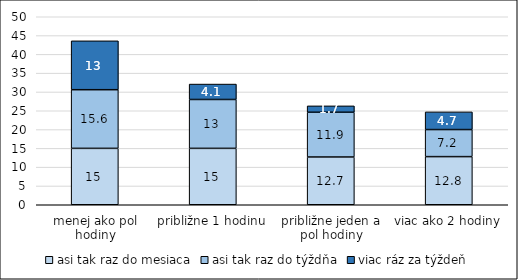
| Category | asi tak raz do mesiaca | asi tak raz do týždňa | viac ráz za týždeň |
|---|---|---|---|
| menej ako pol hodiny | 15 | 15.6 | 13 |
| približne 1 hodinu | 15 | 13 | 4.1 |
| približne jeden a pol hodiny | 12.7 | 11.9 | 1.7 |
| viac ako 2 hodiny | 12.8 | 7.2 | 4.7 |